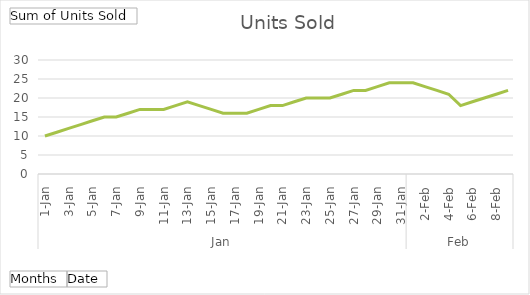
| Category | Total |
|---|---|
| 0 | 10 |
| 1 | 11 |
| 2 | 12 |
| 3 | 13 |
| 4 | 14 |
| 5 | 15 |
| 6 | 15 |
| 7 | 16 |
| 8 | 17 |
| 9 | 17 |
| 10 | 17 |
| 11 | 18 |
| 12 | 19 |
| 13 | 18 |
| 14 | 17 |
| 15 | 16 |
| 16 | 16 |
| 17 | 16 |
| 18 | 17 |
| 19 | 18 |
| 20 | 18 |
| 21 | 19 |
| 22 | 20 |
| 23 | 20 |
| 24 | 20 |
| 25 | 21 |
| 26 | 22 |
| 27 | 22 |
| 28 | 23 |
| 29 | 24 |
| 30 | 24 |
| 31 | 24 |
| 32 | 23 |
| 33 | 22 |
| 34 | 21 |
| 35 | 18 |
| 36 | 19 |
| 37 | 20 |
| 38 | 21 |
| 39 | 22 |